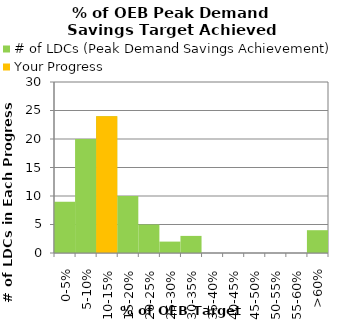
| Category | # of LDCs (Peak Demand Savings Achievement) | Your Progress |
|---|---|---|
| 0-5% | 9 | 0 |
| 5-10% | 20 | 0 |
| 10-15% | 24 | 24 |
| 15-20% | 10 | 0 |
| 20-25% | 5 | 0 |
| 25-30% | 2 | 0 |
| 30-35% | 3 | 0 |
| 35-40% | 0 | 0 |
| 40-45% | 0 | 0 |
| 45-50% | 0 | 0 |
| 50-55% | 0 | 0 |
| 55-60% | 0 | 0 |
| >60% | 4 | 0 |